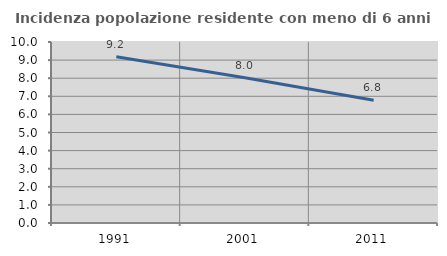
| Category | Incidenza popolazione residente con meno di 6 anni |
|---|---|
| 1991.0 | 9.189 |
| 2001.0 | 8.029 |
| 2011.0 | 6.783 |